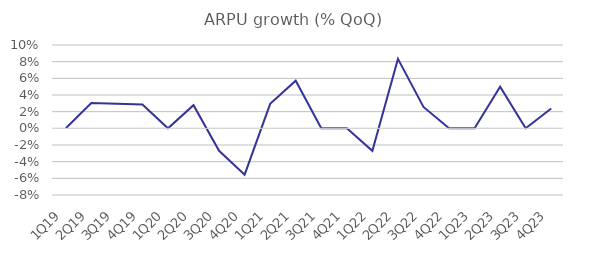
| Category | ARPU growth (% QoQ) |
|---|---|
| 1Q19 | 0 |
| 2Q19 | 0.03 |
| 3Q19 | 0.029 |
| 4Q19 | 0.029 |
| 1Q20 | 0 |
| 2Q20 | 0.028 |
| 3Q20 | -0.027 |
| 4Q20 | -0.056 |
| 1Q21 | 0.029 |
| 2Q21 | 0.057 |
| 3Q21 | 0 |
| 4Q21 | 0 |
| 1Q22 | -0.027 |
| 2Q22 | 0.083 |
| 3Q22 | 0.026 |
| 4Q22 | 0 |
| 1Q23 | 0 |
| 2Q23 | 0.05 |
| 3Q23 | 0 |
| 4Q23 | 0.024 |